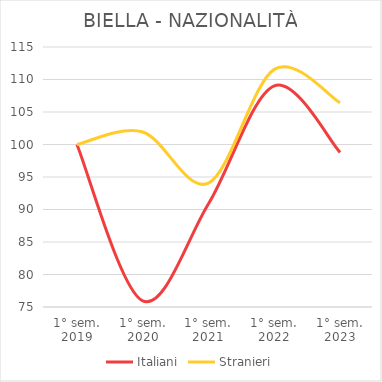
| Category | Italiani | Stranieri |
|---|---|---|
| 1° sem.
2019 | 100 | 100 |
| 1° sem.
2020 | 75.939 | 101.926 |
| 1° sem.
2021 | 90.88 | 94.061 |
| 1° sem.
2022 | 109.034 | 111.557 |
| 1° sem.
2023 | 98.796 | 106.421 |